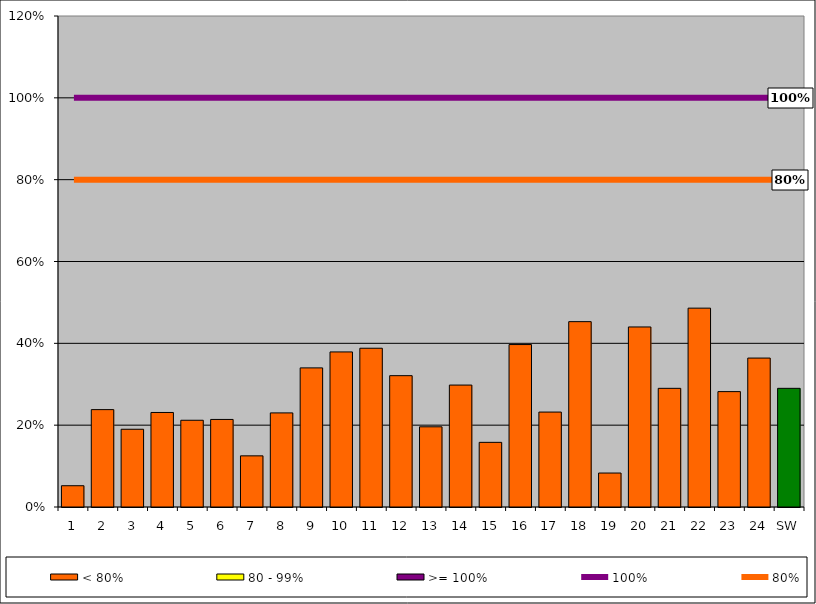
| Category | < 80% | 80 - 99% | >= 100% |
|---|---|---|---|
| 1 | 0.052 | 0 | 0 |
| 2 | 0.238 | 0 | 0 |
| 3 | 0.19 | 0 | 0 |
| 4 | 0.231 | 0 | 0 |
| 5 | 0.212 | 0 | 0 |
| 6 | 0.214 | 0 | 0 |
| 7 | 0.125 | 0 | 0 |
| 8 | 0.23 | 0 | 0 |
| 9 | 0.34 | 0 | 0 |
| 10 | 0.379 | 0 | 0 |
| 11 | 0.388 | 0 | 0 |
| 12 | 0.321 | 0 | 0 |
| 13 | 0.196 | 0 | 0 |
| 14 | 0.298 | 0 | 0 |
| 15 | 0.158 | 0 | 0 |
| 16 | 0.397 | 0 | 0 |
| 17 | 0.232 | 0 | 0 |
| 18 | 0.453 | 0 | 0 |
| 19 | 0.083 | 0 | 0 |
| 20 | 0.44 | 0 | 0 |
| 21 | 0.29 | 0 | 0 |
| 22 | 0.486 | 0 | 0 |
| 23 | 0.282 | 0 | 0 |
| 24 | 0.364 | 0 | 0 |
| SW | 0.29 | 0 | 0 |